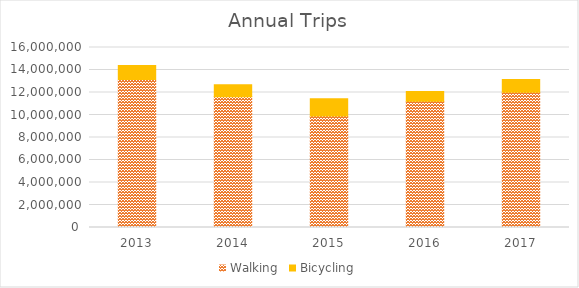
| Category | Walking | Bicycling |
|---|---|---|
| 2013 | 13151246.87 | 1258793.359 |
| 2014 | 11612894.91 | 1086104.919 |
| 2015 | 9914475.703 | 1525936.491 |
| 2016 | 11214861.294 | 874587.297 |
| 2017 | 12014359.575 | 1151830.264 |